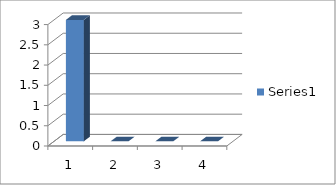
| Category | Series 0 |
|---|---|
| 0 | 3 |
| 1 | 0 |
| 2 | 0 |
| 3 | 0 |